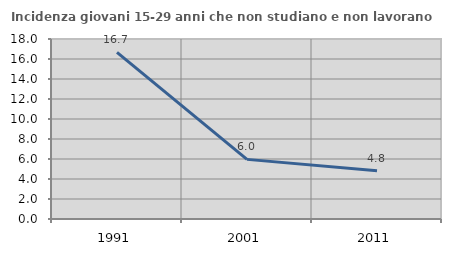
| Category | Incidenza giovani 15-29 anni che non studiano e non lavorano  |
|---|---|
| 1991.0 | 16.667 |
| 2001.0 | 5.962 |
| 2011.0 | 4.834 |